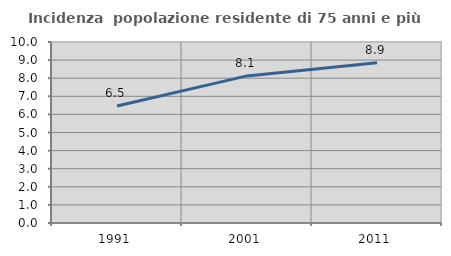
| Category | Incidenza  popolazione residente di 75 anni e più |
|---|---|
| 1991.0 | 6.467 |
| 2001.0 | 8.128 |
| 2011.0 | 8.853 |